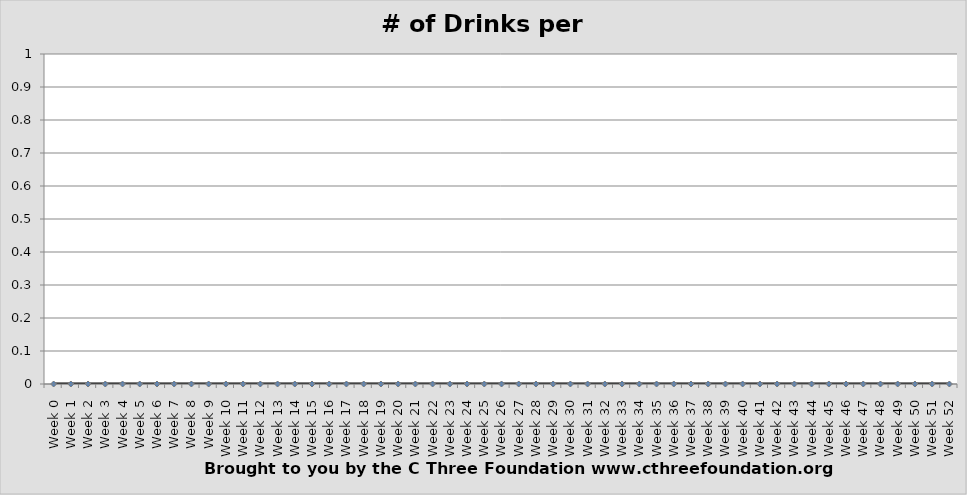
| Category | # of Drinks |
|---|---|
| Week 0 | 0 |
| Week 1 | 0 |
| Week 2 | 0 |
| Week 3 | 0 |
| Week 4 | 0 |
| Week 5 | 0 |
| Week 6 | 0 |
| Week 7 | 0 |
| Week 8 | 0 |
| Week 9 | 0 |
| Week 10 | 0 |
| Week 11 | 0 |
| Week 12 | 0 |
| Week 13 | 0 |
| Week 14 | 0 |
| Week 15 | 0 |
| Week 16 | 0 |
| Week 17 | 0 |
| Week 18 | 0 |
| Week 19 | 0 |
| Week 20 | 0 |
| Week 21 | 0 |
| Week 22 | 0 |
| Week 23 | 0 |
| Week 24 | 0 |
| Week 25 | 0 |
| Week 26 | 0 |
| Week 27 | 0 |
| Week 28 | 0 |
| Week 29 | 0 |
| Week 30 | 0 |
| Week 31 | 0 |
| Week 32 | 0 |
| Week 33 | 0 |
| Week 34 | 0 |
| Week 35 | 0 |
| Week 36 | 0 |
| Week 37 | 0 |
| Week 38 | 0 |
| Week 39 | 0 |
| Week 40 | 0 |
| Week 41 | 0 |
| Week 42 | 0 |
| Week 43 | 0 |
| Week 44 | 0 |
| Week 45 | 0 |
| Week 46 | 0 |
| Week 47 | 0 |
| Week 48 | 0 |
| Week 49 | 0 |
| Week 50 | 0 |
| Week 51 | 0 |
| Week 52 | 0 |